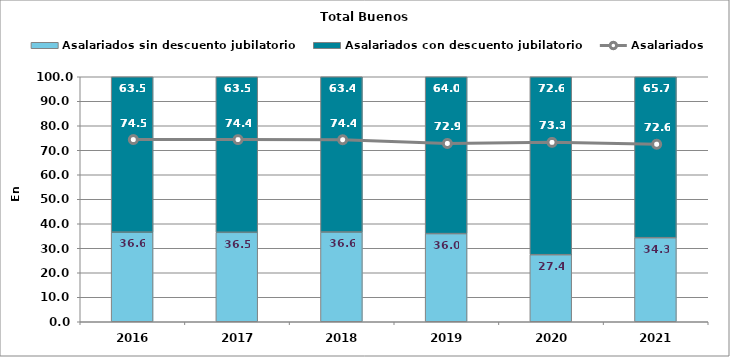
| Category | Asalariados sin descuento jubilatorio | Asalariados con descuento jubilatorio |
|---|---|---|
| 2016.0 | 36.55 | 63.45 |
| 2017.0 | 36.5 | 63.5 |
| 2018.0 | 36.63 | 63.37 |
| 2019.0 | 35.97 | 64.03 |
| 2020.0 | 27.36 | 72.64 |
| 2021.0 | 34.3 | 65.7 |